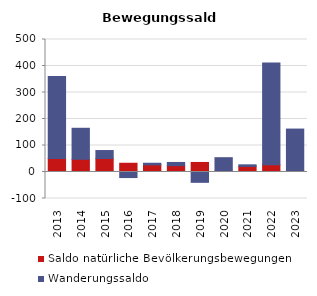
| Category | Saldo natürliche Bevölkerungsbewegungen | Wanderungssaldo |
|---|---|---|
| 2013.0 | 51 | 309 |
| 2014.0 | 48 | 117 |
| 2015.0 | 51 | 30 |
| 2016.0 | 33 | -21 |
| 2017.0 | 27 | 6 |
| 2018.0 | 24 | 12 |
| 2019.0 | 36 | -39 |
| 2020.0 | 3 | 51 |
| 2021.0 | 21 | 6 |
| 2022.0 | 27 | 384 |
| 2023.0 | 3 | 159 |